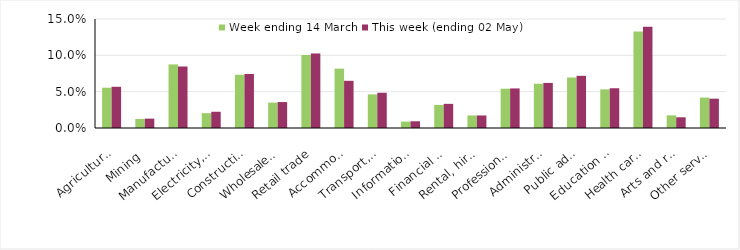
| Category | Week ending 14 March | This week (ending 02 May) |
|---|---|---|
| Agriculture, forestry and fishing | 0.055 | 0.057 |
| Mining | 0.012 | 0.013 |
| Manufacturing | 0.088 | 0.085 |
| Electricity, gas, water and waste services | 0.02 | 0.022 |
| Construction | 0.073 | 0.074 |
| Wholesale trade | 0.035 | 0.036 |
| Retail trade | 0.1 | 0.103 |
| Accommodation and food services | 0.082 | 0.065 |
| Transport, postal and warehousing | 0.046 | 0.048 |
| Information media and telecommunications | 0.009 | 0.009 |
| Financial and insurance services | 0.032 | 0.033 |
| Rental, hiring and real estate services | 0.017 | 0.017 |
| Professional, scientific and technical services | 0.054 | 0.054 |
| Administrative and support services | 0.061 | 0.062 |
| Public administration and safety | 0.07 | 0.072 |
| Education and training | 0.053 | 0.055 |
| Health care and social assistance | 0.133 | 0.139 |
| Arts and recreation services | 0.017 | 0.015 |
| Other services | 0.042 | 0.04 |